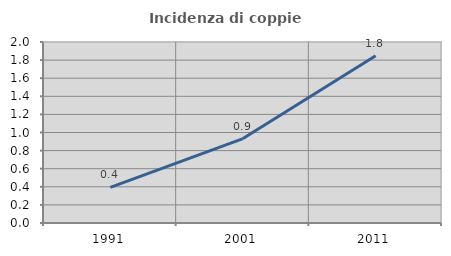
| Category | Incidenza di coppie miste |
|---|---|
| 1991.0 | 0.394 |
| 2001.0 | 0.933 |
| 2011.0 | 1.849 |